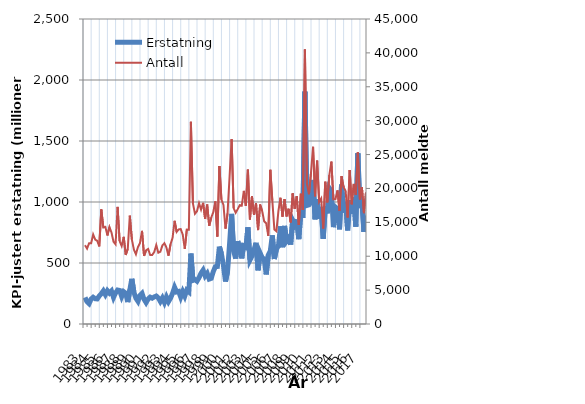
| Category | Erstatning |
|---|---|
| 1983.0 | 217.738 |
| nan | 182.39 |
| nan | 166.795 |
| nan | 204.317 |
| 1984.0 | 219.095 |
| nan | 207.248 |
| nan | 205.483 |
| nan | 229.834 |
| 1985.0 | 248.366 |
| nan | 271.471 |
| nan | 240.555 |
| nan | 272.822 |
| 1986.0 | 252.948 |
| nan | 270.665 |
| nan | 217.848 |
| nan | 254.933 |
| 1987.0 | 278.509 |
| nan | 274.837 |
| nan | 224.911 |
| nan | 264.614 |
| 1988.0 | 251.86 |
| nan | 179.537 |
| nan | 279.633 |
| nan | 370.436 |
| 1989.0 | 261.704 |
| nan | 211.52 |
| nan | 186.12 |
| nan | 234.811 |
| 1990.0 | 251.421 |
| nan | 202.269 |
| nan | 175.421 |
| nan | 204.183 |
| 1991.0 | 220.333 |
| nan | 211.849 |
| nan | 221.715 |
| nan | 229.225 |
| 1992.0 | 214.139 |
| nan | 184.514 |
| nan | 213.2 |
| nan | 175.933 |
| 1993.0 | 220.747 |
| nan | 183.711 |
| nan | 212.245 |
| nan | 251.093 |
| 1994.0 | 300.738 |
| nan | 262.914 |
| nan | 267.117 |
| nan | 220.171 |
| 1995.0 | 265.26 |
| nan | 228.202 |
| nan | 277.29 |
| nan | 263.273 |
| 1996.0 | 577.355 |
| nan | 357.508 |
| nan | 363.895 |
| nan | 350.948 |
| 1997.0 | 379.933 |
| nan | 416.911 |
| nan | 441.514 |
| nan | 393.933 |
| 1998.0 | 415.589 |
| nan | 368.173 |
| nan | 374.188 |
| nan | 430.086 |
| 1999.0 | 469.101 |
| nan | 471.379 |
| nan | 634.301 |
| nan | 574.443 |
| 2000.0 | 478.837 |
| nan | 347.74 |
| nan | 431.1 |
| nan | 657.294 |
| 2001.0 | 902.061 |
| nan | 597.168 |
| nan | 536.336 |
| nan | 678.575 |
| 2002.0 | 618.016 |
| nan | 537.735 |
| nan | 664.547 |
| nan | 605.551 |
| 2003.0 | 791.978 |
| nan | 523.627 |
| nan | 557.072 |
| nan | 606.848 |
| 2004.0 | 665.746 |
| nan | 440.146 |
| nan | 581.891 |
| nan | 543.889 |
| 2005.0 | 532.334 |
| nan | 406.244 |
| nan | 563.978 |
| nan | 597.674 |
| 2006.0 | 726.484 |
| nan | 532.776 |
| nan | 613.024 |
| nan | 639.554 |
| 2007.0 | 800.528 |
| nan | 629.384 |
| nan | 804.144 |
| nan | 679.889 |
| 2008.0 | 703.094 |
| nan | 650.888 |
| nan | 850.097 |
| nan | 816.43 |
| 2009.0 | 856.753 |
| nan | 695.547 |
| nan | 918.799 |
| nan | 868.457 |
| 2010.0 | 1905.043 |
| nan | 971.666 |
| nan | 976.341 |
| nan | 998.838 |
| 2011.0 | 1180.444 |
| nan | 858.391 |
| nan | 1023.5 |
| nan | 862.569 |
| 2012.0 | 955.608 |
| nan | 698.637 |
| nan | 963.225 |
| nan | 906.967 |
| 2013.0 | 1113.851 |
| nan | 1090.67 |
| nan | 793.622 |
| nan | 958.603 |
| 2014.0 | 945.44 |
| nan | 776.393 |
| nan | 1142.115 |
| nan | 913.19 |
| 2015.0 | 1001.888 |
| nan | 767.27 |
| nan | 1015.647 |
| nan | 901.778 |
| 2016.0 | 1036.665 |
| nan | 797.959 |
| nan | 1399.479 |
| nan | 949.547 |
| 2017.0 | 1017.751 |
| nan | 754.949 |
| nan | 887.63 |